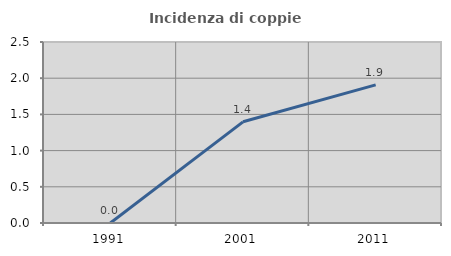
| Category | Incidenza di coppie miste |
|---|---|
| 1991.0 | 0 |
| 2001.0 | 1.398 |
| 2011.0 | 1.908 |